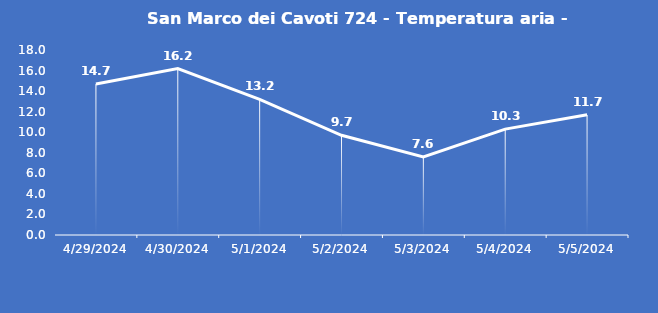
| Category | San Marco dei Cavoti 724 - Temperatura aria - Grezzo (°C) |
|---|---|
| 4/29/24 | 14.7 |
| 4/30/24 | 16.2 |
| 5/1/24 | 13.2 |
| 5/2/24 | 9.7 |
| 5/3/24 | 7.6 |
| 5/4/24 | 10.3 |
| 5/5/24 | 11.7 |